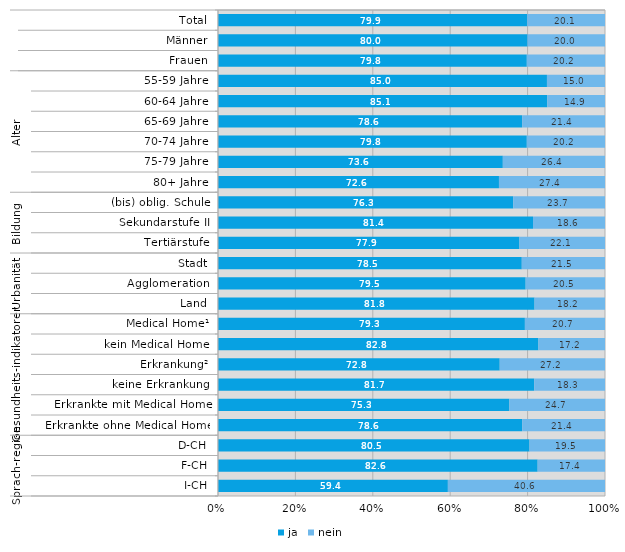
| Category | ja | nein |
|---|---|---|
| 0 | 79.9 | 20.1 |
| 1 | 80 | 20 |
| 2 | 79.8 | 20.2 |
| 3 | 85 | 15 |
| 4 | 85.1 | 14.9 |
| 5 | 78.6 | 21.4 |
| 6 | 79.8 | 20.2 |
| 7 | 73.6 | 26.4 |
| 8 | 72.6 | 27.4 |
| 9 | 76.3 | 23.7 |
| 10 | 81.4 | 18.6 |
| 11 | 77.9 | 22.1 |
| 12 | 78.5 | 21.5 |
| 13 | 79.5 | 20.5 |
| 14 | 81.8 | 18.2 |
| 15 | 79.3 | 20.7 |
| 16 | 82.8 | 17.2 |
| 17 | 72.8 | 27.2 |
| 18 | 81.7 | 18.3 |
| 19 | 75.3 | 24.7 |
| 20 | 78.6 | 21.4 |
| 21 | 80.5 | 19.5 |
| 22 | 82.6 | 17.4 |
| 23 | 59.4 | 40.6 |